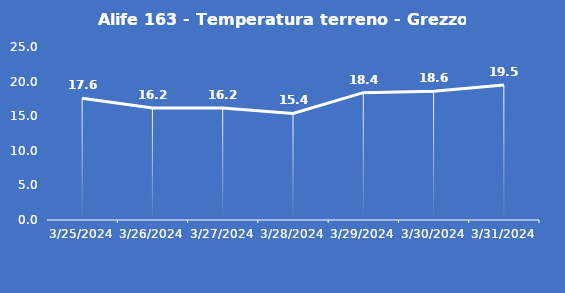
| Category | Alife 163 - Temperatura terreno - Grezzo (°C) |
|---|---|
| 3/25/24 | 17.6 |
| 3/26/24 | 16.2 |
| 3/27/24 | 16.2 |
| 3/28/24 | 15.4 |
| 3/29/24 | 18.4 |
| 3/30/24 | 18.6 |
| 3/31/24 | 19.5 |